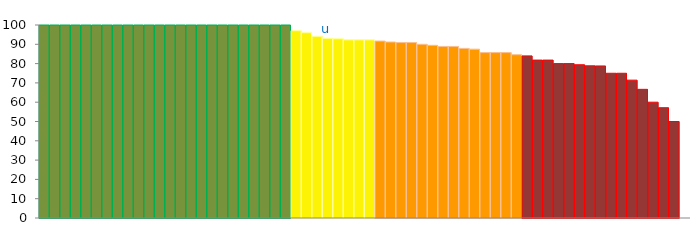
| Category | Top Quartile | 2nd Quartile | 3rd Quartile | Bottom Quartile | Series 4 |
|---|---|---|---|---|---|
|  | 100 | 0 | 0 | 0 | 100 |
|  | 100 | 0 | 0 | 0 | 100 |
|  | 100 | 0 | 0 | 0 | 100 |
|  | 100 | 0 | 0 | 0 | 100 |
|  | 100 | 0 | 0 | 0 | 100 |
|  | 100 | 0 | 0 | 0 | 100 |
|  | 100 | 0 | 0 | 0 | 100 |
|  | 100 | 0 | 0 | 0 | 100 |
|  | 100 | 0 | 0 | 0 | 100 |
|  | 100 | 0 | 0 | 0 | 100 |
|  | 100 | 0 | 0 | 0 | 100 |
|  | 100 | 0 | 0 | 0 | 100 |
|  | 100 | 0 | 0 | 0 | 100 |
|  | 100 | 0 | 0 | 0 | 100 |
|  | 100 | 0 | 0 | 0 | 100 |
|  | 100 | 0 | 0 | 0 | 100 |
|  | 100 | 0 | 0 | 0 | 100 |
|  | 100 | 0 | 0 | 0 | 100 |
|  | 100 | 0 | 0 | 0 | 100 |
|  | 100 | 0 | 0 | 0 | 100 |
|  | 100 | 0 | 0 | 0 | 100 |
|  | 100 | 0 | 0 | 0 | 100 |
|  | 100 | 0 | 0 | 0 | 100 |
|  | 100 | 0 | 0 | 0 | 100 |
|  | 0 | 97.059 | 0 | 0 | 97.059 |
|  | 0 | 96 | 0 | 0 | 96 |
|  | 0 | 94.118 | 0 | 0 | 94.118 |
| u | 0 | 93.103 | 0 | 0 | 93.103 |